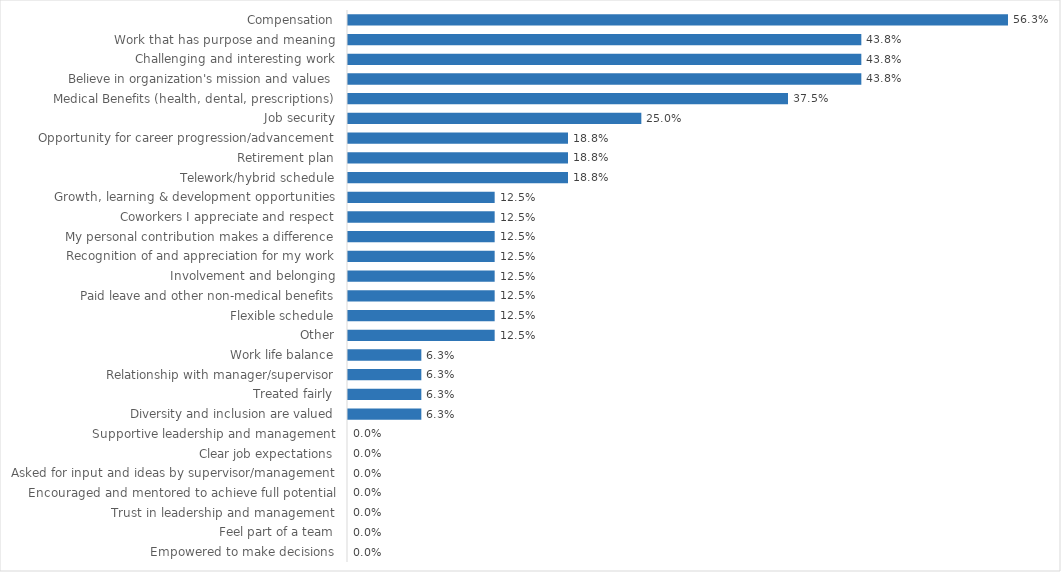
| Category | Libraries |
|---|---|
| Compensation | 0.562 |
| Work that has purpose and meaning | 0.438 |
| Challenging and interesting work | 0.438 |
| Believe in organization's mission and values | 0.438 |
| Medical Benefits (health, dental, prescriptions) | 0.375 |
| Job security | 0.25 |
| Opportunity for career progression/advancement | 0.188 |
| Retirement plan | 0.188 |
| Telework/hybrid schedule | 0.188 |
| Growth, learning & development opportunities | 0.125 |
| Coworkers I appreciate and respect | 0.125 |
| My personal contribution makes a difference | 0.125 |
| Recognition of and appreciation for my work | 0.125 |
| Involvement and belonging | 0.125 |
| Paid leave and other non-medical benefits | 0.125 |
| Flexible schedule | 0.125 |
| Other | 0.125 |
| Work life balance | 0.062 |
| Relationship with manager/supervisor | 0.062 |
| Treated fairly | 0.062 |
| Diversity and inclusion are valued | 0.062 |
| Supportive leadership and management | 0 |
| Clear job expectations | 0 |
| Asked for input and ideas by supervisor/management | 0 |
| Encouraged and mentored to achieve full potential | 0 |
| Trust in leadership and management | 0 |
| Feel part of a team | 0 |
| Empowered to make decisions | 0 |